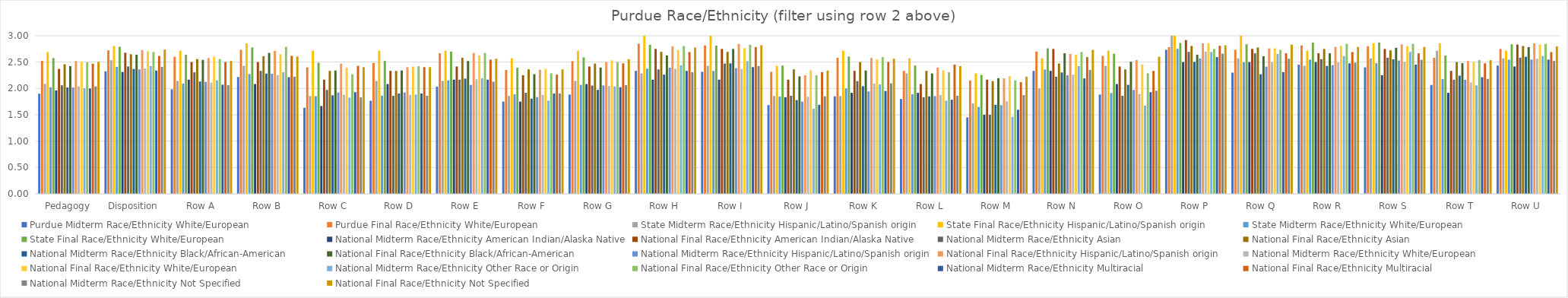
| Category | Purdue | State | National |
|---|---|---|---|
| Pedagogy | 2.523 | 2.576 | 2.505 |
| Disposition | 2.723 | 2.791 | 2.737 |
| Row A | 2.6 | 2.641 | 2.521 |
| Row B | 2.733 | 2.778 | 2.606 |
| Row C | 2.4 | 2.487 | 2.404 |
| Row D | 2.483 | 2.521 | 2.404 |
| Row E | 2.667 | 2.701 | 2.564 |
| Row F | 2.35 | 2.393 | 2.362 |
| Row G | 2.517 | 2.59 | 2.553 |
| Row H | 2.85 | 2.829 | 2.777 |
| Row I | 2.817 | 2.812 | 2.819 |
| Row J | 2.317 | 2.436 | 2.34 |
| Row K | 2.583 | 2.607 | 2.564 |
| Row L | 2.333 | 2.436 | 2.426 |
| Row M | 2.15 | 2.256 | 2.223 |
| Row N | 2.7 | 2.761 | 2.731 |
| Row O | 2.617 | 2.658 | 2.602 |
| Row P | 2.783 | 2.863 | 2.819 |
| Row Q | 2.733 | 2.838 | 2.83 |
| Row R | 2.817 | 2.872 | 2.787 |
| Row S | 2.8 | 2.872 | 2.787 |
| Row T | 2.583 | 2.624 | 2.538 |
| Row U | 2.75 | 2.838 | 2.798 |